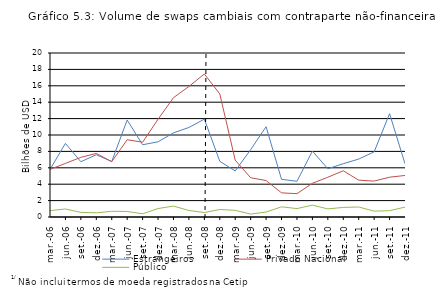
| Category | Estrangeiros | Privado Nacional | Público |
|---|---|---|---|
| 2006-03-01 | 5804738397.308 | 5803301340.639 | 772401041.24 |
| 2006-06-01 | 8980300595.758 | 6535348746.979 | 978237541.874 |
| 2006-09-01 | 6741536574.172 | 7276932915.896 | 563853814.22 |
| 2006-12-01 | 7594536362.154 | 7753872280.825 | 506296811.234 |
| 2007-03-01 | 6766205775.646 | 6746022685.361 | 695780071.131 |
| 2007-06-01 | 11828416006.196 | 9425749234.356 | 675845551.819 |
| 2007-09-01 | 8809895596.942 | 9118870078.754 | 391553962.701 |
| 2007-12-01 | 9171450640.026 | 11919278926.298 | 1029875682.807 |
| 2008-03-01 | 10258529697.264 | 14553983732.55 | 1333214344.761 |
| 2008-06-01 | 10915113305.987 | 15915416467.071 | 795356716.508 |
| 2008-09-01 | 11933183333.422 | 17444183456.707 | 545364022.241 |
| 2008-12-01 | 6790628072.558 | 15006761498.843 | 915153032.843 |
| 2009-03-01 | 5614203630.505 | 6933449662.223 | 812382390.212 |
| 2009-06-01 | 8209893866.352 | 4788338318.219 | 358901485.549 |
| 2009-09-01 | 11013227423.136 | 4449185586.668 | 607608689.939 |
| 2009-12-01 | 4595401334.604 | 2942089569.704 | 1241407717.552 |
| 2010-03-01 | 4355261913.632 | 2845303521.438 | 1026975642.526 |
| 2010-06-01 | 8034628519.285 | 4109312632.703 | 1445350004.672 |
| 2010-09-01 | 5881908799.185 | 4849211277.505 | 989525730.159 |
| 2010-12-01 | 6498647639.323 | 5636249278.581 | 1166271389.036 |
| 2011-03-01 | 7067431160.041 | 4493744393.318 | 1221099804.44 |
| 2011-06-01 | 7937202908.275 | 4379309788.927 | 713340069.552 |
| 2011-09-01 | 12602445306.299 | 4857028064.694 | 772014171.436 |
| 2011-12-01 | 6496962681.471 | 5063839847.267 | 1205809804.422 |